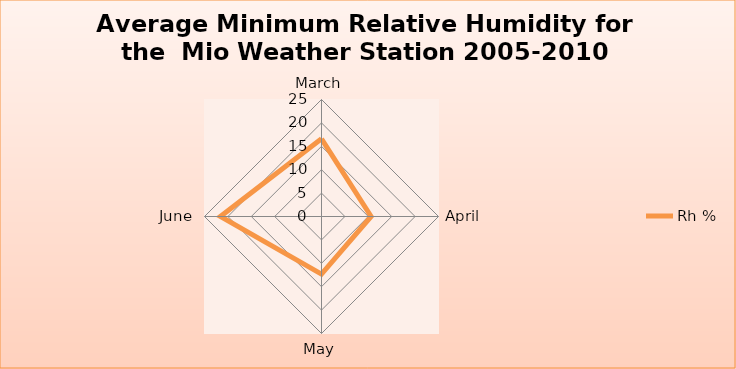
| Category | Rh % |
|---|---|
| March | 16.6 |
| April | 10.6 |
| May | 12.3 |
| June | 21.6 |